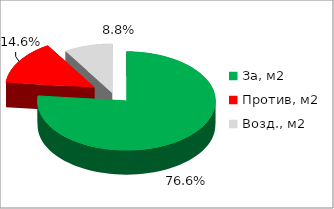
| Category | Series 0 |
|---|---|
| За, м2 | 0.766 |
| Против, м2 | 0.146 |
| Возд., м2 | 0.088 |